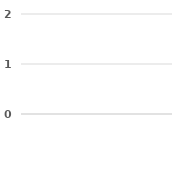
| Category | Series 0 | Series 1 | Series 2 |
|---|---|---|---|
|  | 0 | 0 | 0 |
|  | 0 | 0 | 0 |
|  | 0 | 0 | 0 |
|  | 0 | 0 | 0 |
|  | 0 | 0 | 0 |
|  | 0 | 0 | 0 |
|  | 0 | 0 | 0 |